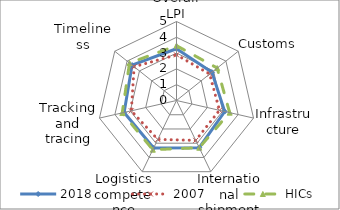
| Category | 2018 | 2007 | HICs |
|---|---|---|---|
| Overall LPI | 3.276 | 2.889 | 3.472 |
| Customs | 2.866 | 2.684 | 3.293 |
| Infrastructure | 3.13 | 2.789 | 3.452 |
| International shipments | 3.315 | 2.8 | 3.317 |
| Logistics competence | 3.333 | 2.733 | 3.457 |
| Tracking and tracing | 3.4 | 2.933 | 3.521 |
| Timeliness | 3.597 | 3.429 | 3.804 |